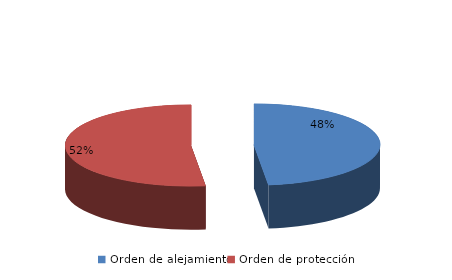
| Category | Series 0 |
|---|---|
| Orden de alejamiento | 26 |
| Orden de protección | 28 |